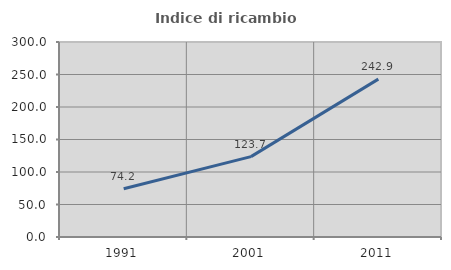
| Category | Indice di ricambio occupazionale  |
|---|---|
| 1991.0 | 74.214 |
| 2001.0 | 123.698 |
| 2011.0 | 242.857 |